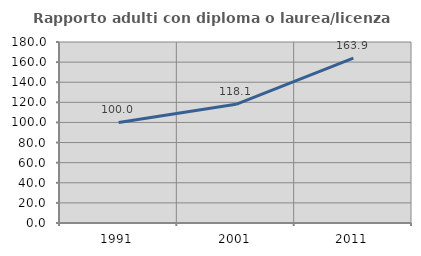
| Category | Rapporto adulti con diploma o laurea/licenza media  |
|---|---|
| 1991.0 | 100 |
| 2001.0 | 118.056 |
| 2011.0 | 163.889 |